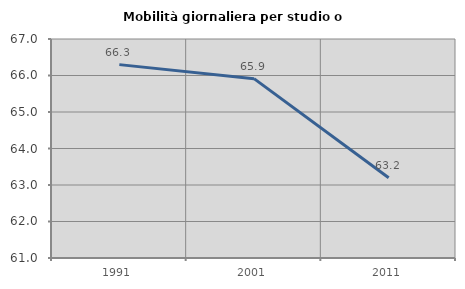
| Category | Mobilità giornaliera per studio o lavoro |
|---|---|
| 1991.0 | 66.298 |
| 2001.0 | 65.914 |
| 2011.0 | 63.197 |